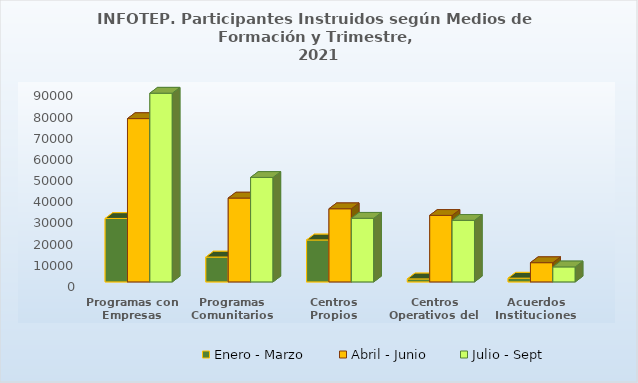
| Category | Enero - Marzo | Abril - Junio | Julio - Sept |
|---|---|---|---|
| Programas con Empresas | 29969 | 77149 | 89144 |
| Programas Comunitarios | 11746 | 39606 | 49355 |
| Centros Propios | 19826 | 34557 | 30062 |
| Centros Operativos del Sistema | 1418 | 31426 | 29080 |
| Acuerdos Instituciones | 1758 | 9084 | 7089 |